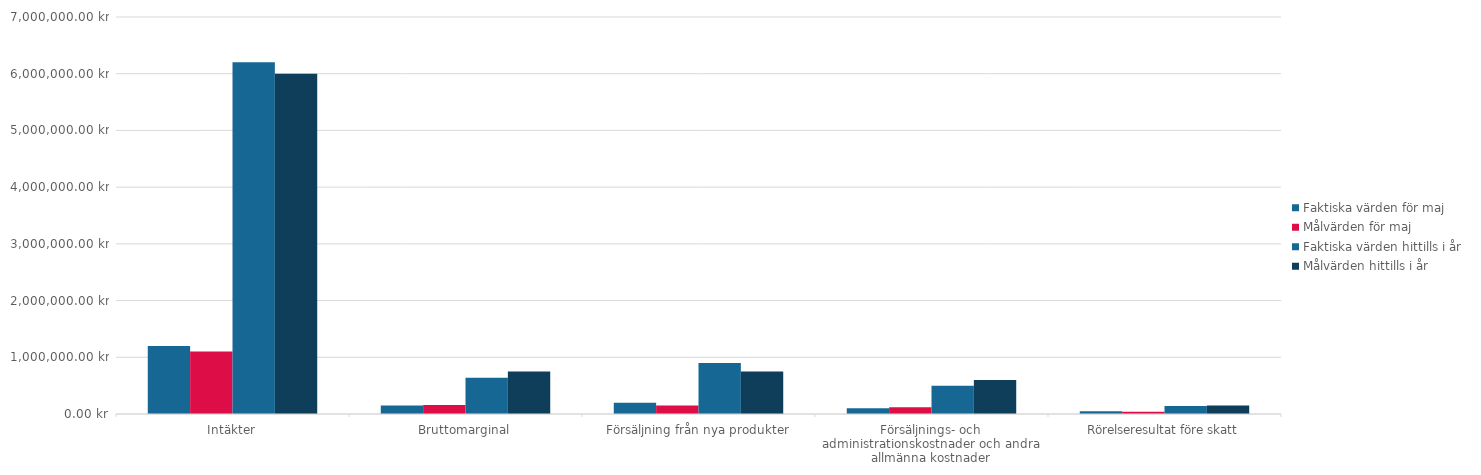
| Category | Faktiska värden för maj | Målvärden för maj | Faktiska värden hittills i år | Målvärden hittills i år |
|---|---|---|---|---|
| Intäkter | 1200000 | 1100000 | 6200000 | 6000000 |
| Bruttomarginal | 150000 | 160000 | 640000 | 750000 |
| Försäljning från nya produkter | 200000 | 150000 | 900000 | 750000 |
| Försäljnings- och administrationskostnader och andra allmänna kostnader | 100000 | 120000 | 500000 | 600000 |
| Rörelseresultat före skatt | 50000 | 40000 | 140000 | 150000 |